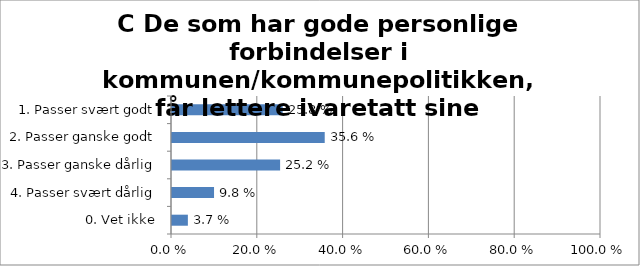
| Category | C De som har gode personlige forbindelser i kommunen/kommunepolitikken, får lettere ivaretatt sine interesser |
|---|---|
| 1. Passer svært godt | 0.258 |
| 2. Passer ganske godt | 0.356 |
| 3. Passer ganske dårlig | 0.252 |
| 4. Passer svært dårlig | 0.098 |
| 0. Vet ikke | 0.037 |